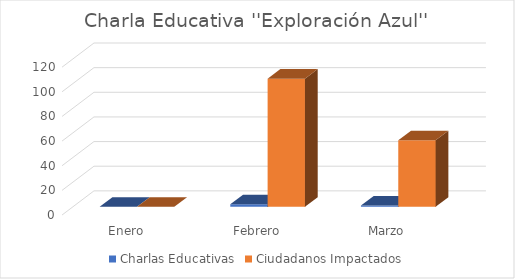
| Category | Charlas Educativas | Ciudadanos Impactados |
|---|---|---|
| Enero | 0 | 0 |
| Febrero | 2 | 104 |
| Marzo | 1 | 54 |